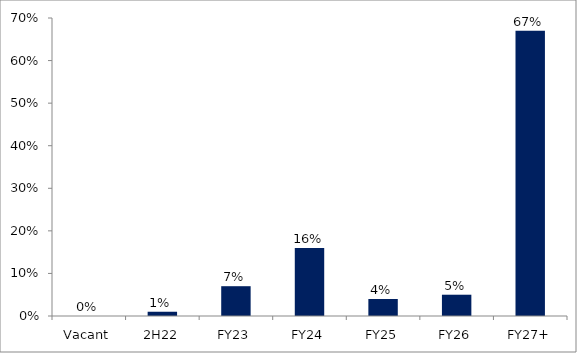
| Category | Series 0 |
|---|---|
| Vacant | 0 |
| 2H22 | 0.01 |
| FY23 | 0.07 |
| FY24 | 0.16 |
| FY25 | 0.04 |
| FY26 | 0.05 |
| FY27+ | 0.67 |